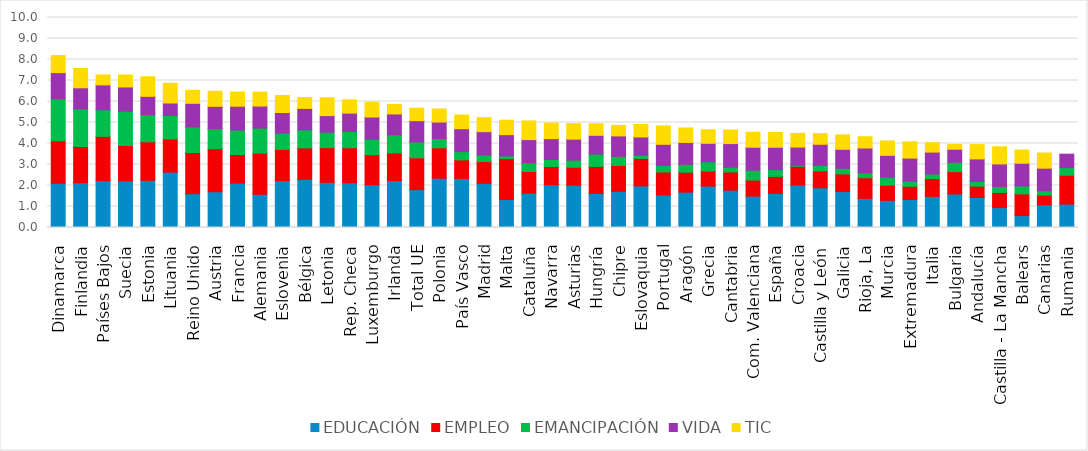
| Category | EDUCACIÓN | EMPLEO | EMANCIPACIÓN | VIDA | TIC |
|---|---|---|---|---|---|
| Dinamarca | 2.107 | 2.026 | 2 | 1.242 | 0.812 |
| Finlandia | 2.133 | 1.722 | 1.789 | 1.008 | 0.92 |
| Países Bajos | 2.227 | 2.113 | 1.268 | 1.184 | 0.475 |
| Suecia | 2.215 | 1.69 | 1.633 | 1.154 | 0.569 |
| Estonia | 2.245 | 1.835 | 1.289 | 0.877 | 0.933 |
| Lituania | 2.637 | 1.578 | 1.115 | 0.598 | 0.941 |
| Reino Unido | 1.61 | 1.96 | 1.217 | 1.126 | 0.621 |
| Austria | 1.703 | 2.049 | 0.959 | 1.06 | 0.717 |
| Francia | 2.116 | 1.356 | 1.171 | 1.132 | 0.676 |
| Alemania | 1.581 | 1.959 | 1.196 | 1.048 | 0.664 |
| Eslovenia | 2.231 | 1.486 | 0.775 | 0.984 | 0.811 |
| Bélgica | 2.297 | 1.491 | 0.864 | 1.02 | 0.515 |
| Letonia | 2.15 | 1.653 | 0.734 | 0.79 | 0.85 |
| Rep. Checa | 2.131 | 1.667 | 0.778 | 0.871 | 0.633 |
| Luxemburgo | 2.039 | 1.428 | 0.737 | 1.057 | 0.705 |
| Irlanda | 2.233 | 1.317 | 0.863 | 0.994 | 0.458 |
| Total UE | 1.802 | 1.518 | 0.755 | 1.012 | 0.593 |
| Polonia | 2.347 | 1.448 | 0.444 | 0.783 | 0.621 |
| País Vasco | 2.337 | 0.883 | 0.391 | 1.092 | 0.653 |
| Madrid | 2.102 | 1.036 | 0.315 | 1.11 | 0.669 |
| Malta | 1.332 | 1.946 | 0.129 | 1.014 | 0.688 |
| Cataluña | 1.631 | 1.034 | 0.421 | 1.098 | 0.889 |
| Navarra | 2.038 | 0.864 | 0.337 | 0.992 | 0.743 |
| Asturias | 2.016 | 0.849 | 0.344 | 0.997 | 0.741 |
| Hungría | 1.621 | 1.287 | 0.59 | 0.892 | 0.549 |
| Chipre | 1.725 | 1.227 | 0.434 | 0.977 | 0.499 |
| Eslovaquia | 1.98 | 1.31 | 0.151 | 0.87 | 0.597 |
| Portugal | 1.549 | 1.096 | 0.316 | 1.002 | 0.877 |
| Aragón | 1.686 | 0.947 | 0.374 | 1.043 | 0.694 |
| Grecia | 1.972 | 0.717 | 0.445 | 0.876 | 0.645 |
| Cantabria | 1.775 | 0.871 | 0.224 | 1.126 | 0.649 |
| Com. Valenciana | 1.494 | 0.764 | 0.469 | 1.094 | 0.712 |
| España | 1.628 | 0.805 | 0.323 | 1.066 | 0.701 |
| Croacia | 2.022 | 0.891 | 0.051 | 0.867 | 0.65 |
| Castilla y León | 1.891 | 0.8 | 0.272 | 1.001 | 0.508 |
| Galicia | 1.71 | 0.842 | 0.267 | 0.905 | 0.686 |
| Rioja, La | 1.385 | 0.984 | 0.237 | 1.18 | 0.536 |
| Murcia | 1.292 | 0.721 | 0.384 | 1.039 | 0.687 |
| Extremadura | 1.335 | 0.625 | 0.248 | 1.096 | 0.778 |
| Italia | 1.482 | 0.848 | 0.22 | 1.04 | 0.447 |
| Bulgaria | 1.595 | 1.064 | 0.445 | 0.622 | 0.229 |
| Andalucía | 1.432 | 0.537 | 0.22 | 1.076 | 0.683 |
| Castilla - La Mancha | 0.947 | 0.722 | 0.286 | 1.073 | 0.817 |
| Balears | 0.566 | 1.034 | 0.378 | 1.082 | 0.63 |
| Canarias | 1.081 | 0.461 | 0.207 | 1.078 | 0.722 |
| Rumania | 1.117 | 1.37 | 0.367 | 0.637 | 0 |